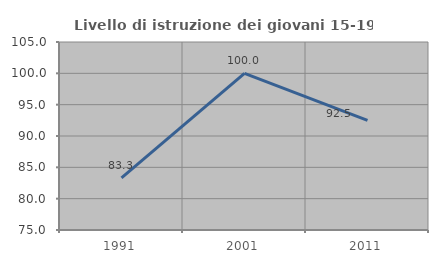
| Category | Livello di istruzione dei giovani 15-19 anni |
|---|---|
| 1991.0 | 83.333 |
| 2001.0 | 100 |
| 2011.0 | 92.5 |